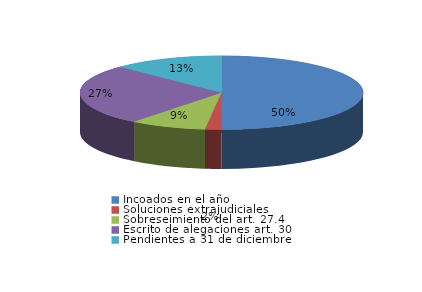
| Category | Series 0 |
|---|---|
| Incoados en el año | 351 |
| Soluciones extrajudiciales | 13 |
| Sobreseimiento del art. 27.4 | 61 |
| Escrito de alegaciones art. 30 | 188 |
| Pendientes a 31 de diciembre | 89 |